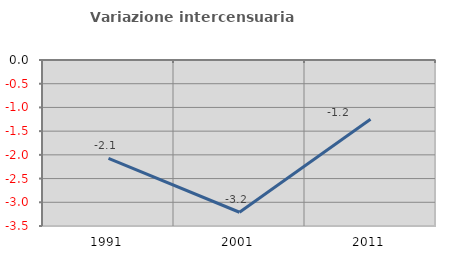
| Category | Variazione intercensuaria annua |
|---|---|
| 1991.0 | -2.072 |
| 2001.0 | -3.21 |
| 2011.0 | -1.249 |